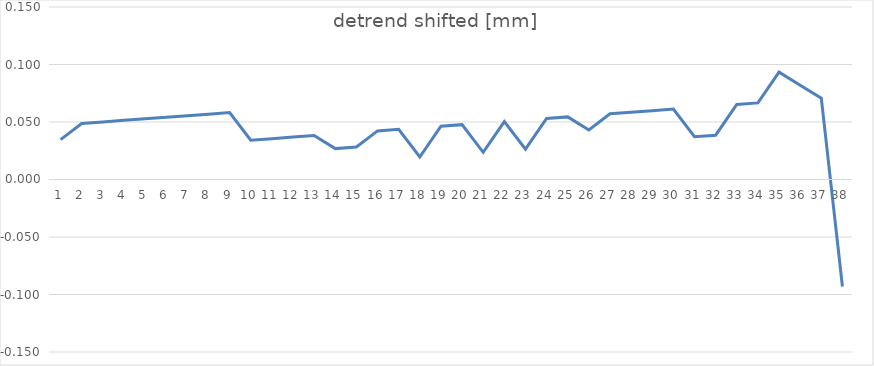
| Category | detrend shifted |
|---|---|
| 0 | 0.035 |
| 1 | 0.049 |
| 2 | 0.05 |
| 3 | 0.051 |
| 4 | 0.053 |
| 5 | 0.054 |
| 6 | 0.055 |
| 7 | 0.057 |
| 8 | 0.058 |
| 9 | 0.034 |
| 10 | 0.036 |
| 11 | 0.037 |
| 12 | 0.038 |
| 13 | 0.027 |
| 14 | 0.028 |
| 15 | 0.042 |
| 16 | 0.044 |
| 17 | 0.02 |
| 18 | 0.046 |
| 19 | 0.048 |
| 20 | 0.024 |
| 21 | 0.05 |
| 22 | 0.026 |
| 23 | 0.053 |
| 24 | 0.054 |
| 25 | 0.043 |
| 26 | 0.057 |
| 27 | 0.059 |
| 28 | 0.06 |
| 29 | 0.061 |
| 30 | 0.037 |
| 31 | 0.039 |
| 32 | 0.065 |
| 33 | 0.067 |
| 34 | 0.093 |
| 35 | 0.082 |
| 36 | 0.071 |
| 37 | -0.093 |